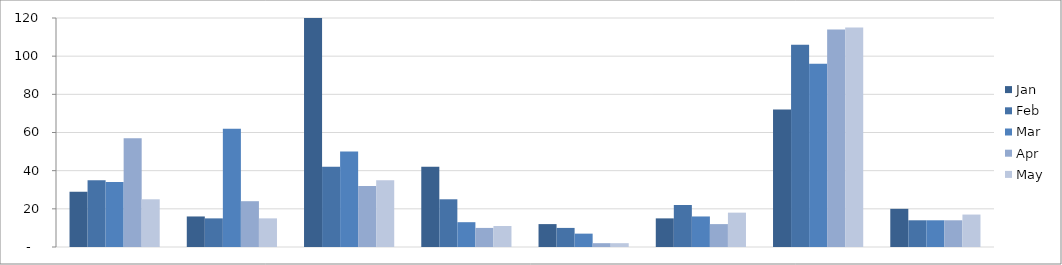
| Category | Jan | Feb | Mar | Apr | May |
|---|---|---|---|---|---|
| Dashboard Tutorial #1 | 29 | 35 | 34 | 57 | 25 |
| Excel Formula e-book | 16 | 15 | 62 | 24 | 15 |
| Excel School - Dashboards Membership | 121 | 42 | 50 | 32 | 35 |
| Excel School - Download Membership | 42 | 25 | 13 | 10 | 11 |
| Excel School - Online Membership | 12 | 10 | 7 | 2 | 2 |
| PM Templates for Excel [2003] | 15 | 22 | 16 | 12 | 18 |
| PM Templates for Excel [2007] | 72 | 106 | 96 | 114 | 115 |
| PM Templates for Excel [both] | 20 | 14 | 14 | 14 | 17 |